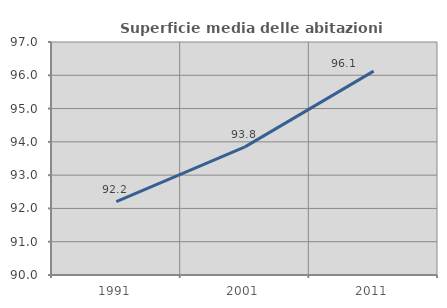
| Category | Superficie media delle abitazioni occupate |
|---|---|
| 1991.0 | 92.201 |
| 2001.0 | 93.849 |
| 2011.0 | 96.126 |